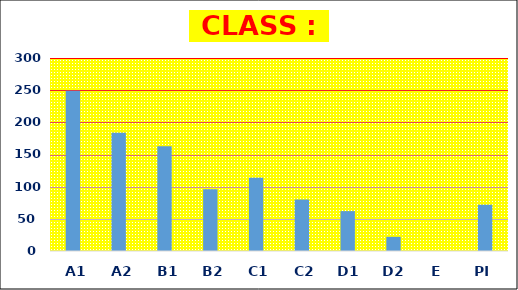
| Category | Series 0 |
|---|---|
| A1 | 249 |
| A2 | 184 |
| B1 | 163 |
| B2 | 96 |
| C1 | 114 |
| C2 | 80 |
| D1 | 62 |
| D2 | 22 |
| E | 0 |
| PI | 71.91 |